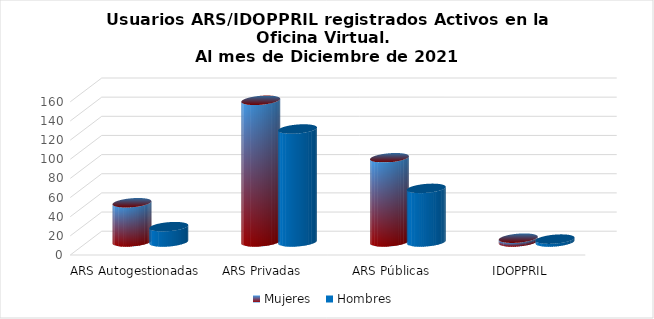
| Category | Mujeres | Hombres |
|---|---|---|
| ARS Autogestionadas | 41 | 16 |
| ARS Privadas | 148 | 118 |
| ARS Públicas | 88 | 56 |
| IDOPPRIL | 4 | 3 |